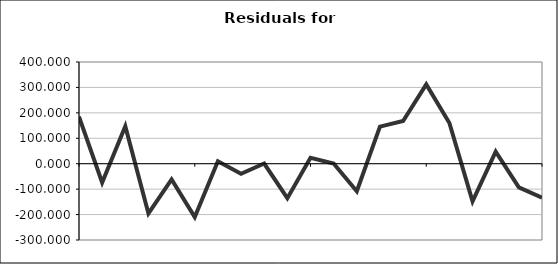
| Category | Series 0 |
|---|---|
| 0 | 184.653 |
| 1 | -74 |
| 2 | 146.986 |
| 3 | -195.56 |
| 4 | -61.672 |
| 5 | -209.896 |
| 6 | 9.535 |
| 7 | -39.47 |
| 8 | 0.777 |
| 9 | -135.739 |
| 10 | 23.55 |
| 11 | 0.554 |
| 12 | -108.133 |
| 13 | 145.917 |
| 14 | 167.72 |
| 15 | 312.037 |
| 16 | 160.002 |
| 17 | -148.178 |
| 18 | 47.765 |
| 19 | -92.934 |
| 20 | -133.914 |